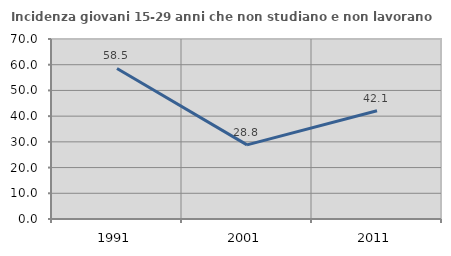
| Category | Incidenza giovani 15-29 anni che non studiano e non lavorano  |
|---|---|
| 1991.0 | 58.543 |
| 2001.0 | 28.829 |
| 2011.0 | 42.105 |